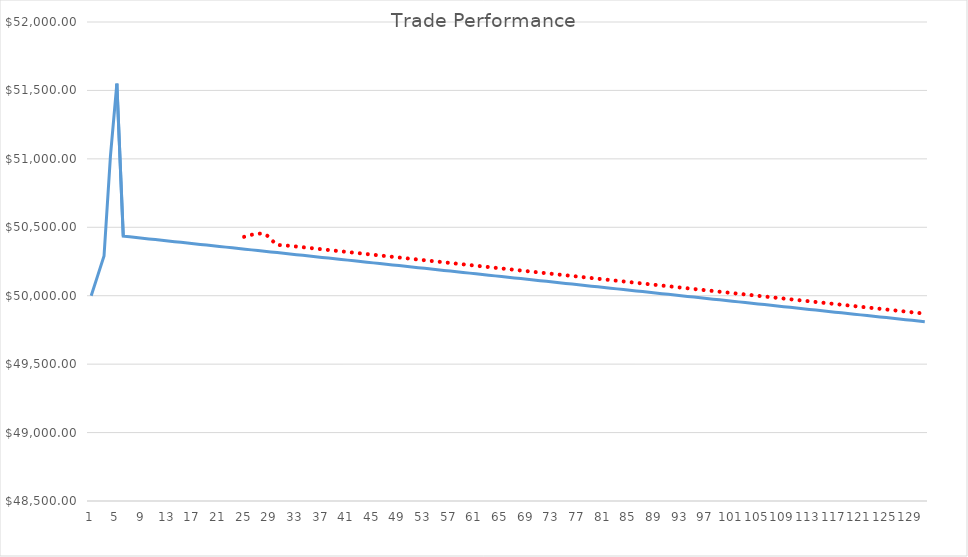
| Category | Series 0 |
|---|---|
| 0 | 50000 |
| 1 | 50145 |
| 2 | 50290 |
| 3 | 51020 |
| 4 | 51550 |
| 5 | 50435 |
| 6 | 50430 |
| 7 | 50425 |
| 8 | 50420 |
| 9 | 50415 |
| 10 | 50410 |
| 11 | 50405 |
| 12 | 50400 |
| 13 | 50395 |
| 14 | 50390 |
| 15 | 50385 |
| 16 | 50380 |
| 17 | 50375 |
| 18 | 50370 |
| 19 | 50365 |
| 20 | 50360 |
| 21 | 50355 |
| 22 | 50350 |
| 23 | 50345 |
| 24 | 50340 |
| 25 | 50335 |
| 26 | 50330 |
| 27 | 50325 |
| 28 | 50320 |
| 29 | 50315 |
| 30 | 50310 |
| 31 | 50305 |
| 32 | 50300 |
| 33 | 50295 |
| 34 | 50290 |
| 35 | 50285 |
| 36 | 50280 |
| 37 | 50275 |
| 38 | 50270 |
| 39 | 50265 |
| 40 | 50260 |
| 41 | 50255 |
| 42 | 50250 |
| 43 | 50245 |
| 44 | 50240 |
| 45 | 50235 |
| 46 | 50230 |
| 47 | 50225 |
| 48 | 50220 |
| 49 | 50215 |
| 50 | 50210 |
| 51 | 50205 |
| 52 | 50200 |
| 53 | 50195 |
| 54 | 50190 |
| 55 | 50185 |
| 56 | 50180 |
| 57 | 50175 |
| 58 | 50170 |
| 59 | 50165 |
| 60 | 50160 |
| 61 | 50155 |
| 62 | 50150 |
| 63 | 50145 |
| 64 | 50140 |
| 65 | 50135 |
| 66 | 50130 |
| 67 | 50125 |
| 68 | 50120 |
| 69 | 50115 |
| 70 | 50110 |
| 71 | 50105 |
| 72 | 50100 |
| 73 | 50095 |
| 74 | 50090 |
| 75 | 50085 |
| 76 | 50080 |
| 77 | 50075 |
| 78 | 50070 |
| 79 | 50065 |
| 80 | 50060 |
| 81 | 50055 |
| 82 | 50050 |
| 83 | 50045 |
| 84 | 50040 |
| 85 | 50035 |
| 86 | 50030 |
| 87 | 50025 |
| 88 | 50020 |
| 89 | 50015 |
| 90 | 50010 |
| 91 | 50005 |
| 92 | 50000 |
| 93 | 49995 |
| 94 | 49990 |
| 95 | 49985 |
| 96 | 49980 |
| 97 | 49975 |
| 98 | 49970 |
| 99 | 49965 |
| 100 | 49960 |
| 101 | 49955 |
| 102 | 49950 |
| 103 | 49945 |
| 104 | 49940 |
| 105 | 49935 |
| 106 | 49930 |
| 107 | 49925 |
| 108 | 49920 |
| 109 | 49915 |
| 110 | 49910 |
| 111 | 49905 |
| 112 | 49900 |
| 113 | 49895 |
| 114 | 49890 |
| 115 | 49885 |
| 116 | 49880 |
| 117 | 49875 |
| 118 | 49870 |
| 119 | 49865 |
| 120 | 49860 |
| 121 | 49855 |
| 122 | 49850 |
| 123 | 49845 |
| 124 | 49840 |
| 125 | 49835 |
| 126 | 49830 |
| 127 | 49825 |
| 128 | 49820 |
| 129 | 49815 |
| 130 | 49810 |